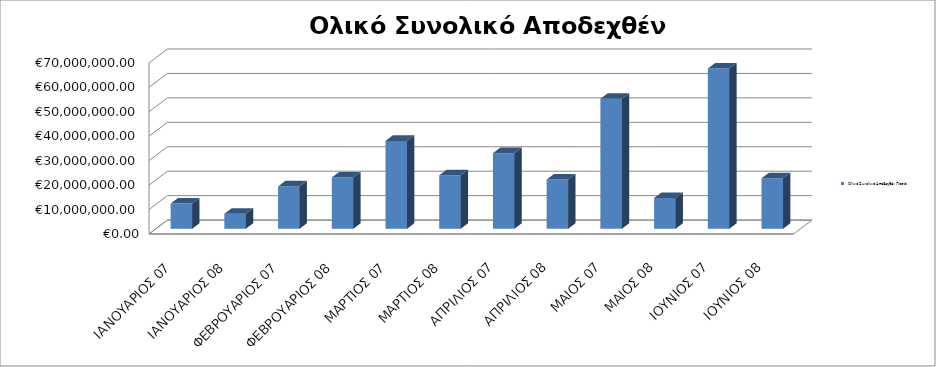
| Category | Ολικό Συνολικό Αποδεχθέν Ποσό: |
|---|---|
| ΙΑΝΟΥΑΡΙΟΣ 07 | 10300034.5 |
| ΙΑΝΟΥΑΡΙΟΣ 08 | 6175437.68 |
| ΦΕΒΡΟΥΑΡΙΟΣ 07 | 17335678.74 |
| ΦΕΒΡΟΥΑΡΙΟΣ 08 | 21006044.2 |
| ΜΑΡΤΙΟΣ 07 | 35958492.91 |
| ΜΑΡΤΙΟΣ 08 | 21850421.66 |
| ΑΠΡΙΛΙΟΣ 07 | 30927770.56 |
| ΑΠΡΙΛΙΟΣ 08 | 20185875.14 |
| ΜΑΙΟΣ 07 | 53201991.63 |
| ΜΑΙΟΣ 08 | 12594166.54 |
| ΙΟΥΝΙΟΣ 07 | 65562669.79 |
| ΙΟΥΝΙΟΣ 08 | 20684511.56 |